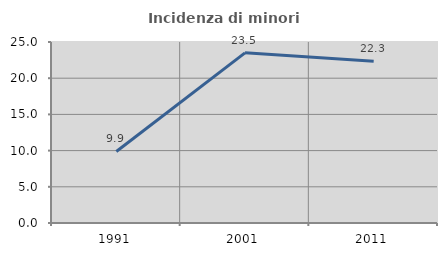
| Category | Incidenza di minori stranieri |
|---|---|
| 1991.0 | 9.884 |
| 2001.0 | 23.502 |
| 2011.0 | 22.337 |